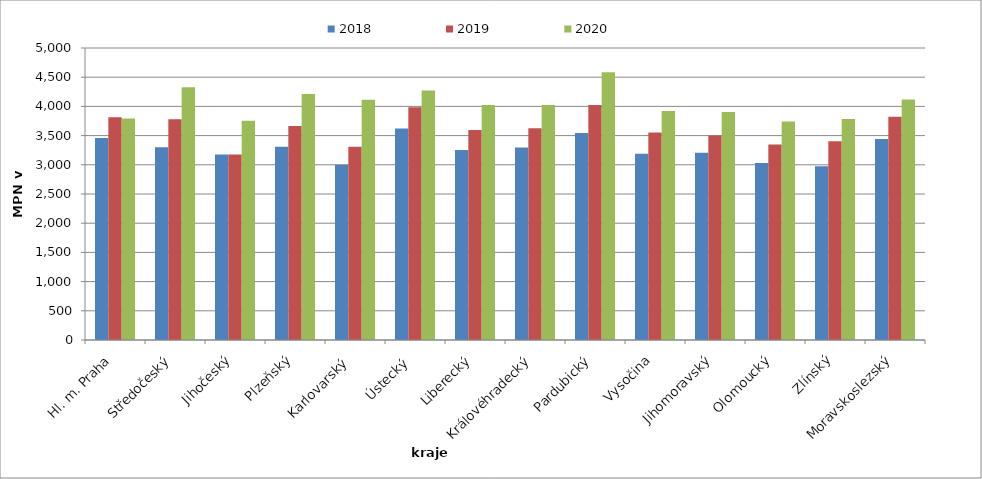
| Category | 2018 | 2019 | 2020 |
|---|---|---|---|
| Hl. m. Praha | 3461 | 3815 | 3793 |
| Středočeský | 3301 | 3778 | 4328 |
| Jihočeský | 3177 | 3177 | 3753 |
| Plzeňský | 3310 | 3663 | 4214 |
| Karlovarský  | 3002 | 3311 | 4112 |
| Ústecký   | 3622 | 3985 | 4273 |
| Liberecký | 3252 | 3597 | 4022 |
| Královéhradecký | 3296 | 3626 | 4024 |
| Pardubický | 3543 | 4023 | 4586 |
| Vysočina | 3189 | 3555 | 3923 |
| Jihomoravský | 3205 | 3500 | 3903 |
| Olomoucký | 3029 | 3347 | 3742 |
| Zlínský | 2975 | 3404 | 3786 |
| Moravskoslezský | 3443 | 3822 | 4118 |